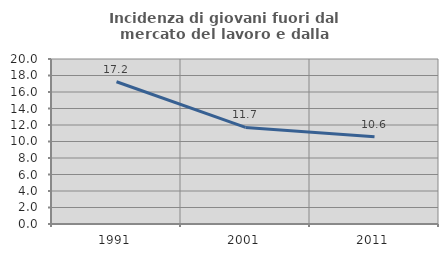
| Category | Incidenza di giovani fuori dal mercato del lavoro e dalla formazione  |
|---|---|
| 1991.0 | 17.241 |
| 2001.0 | 11.702 |
| 2011.0 | 10.588 |